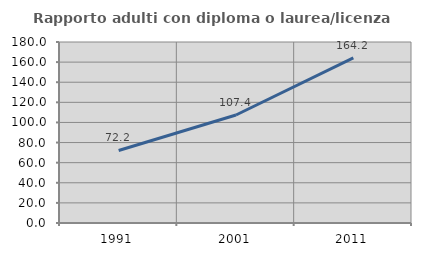
| Category | Rapporto adulti con diploma o laurea/licenza media  |
|---|---|
| 1991.0 | 72.157 |
| 2001.0 | 107.395 |
| 2011.0 | 164.217 |